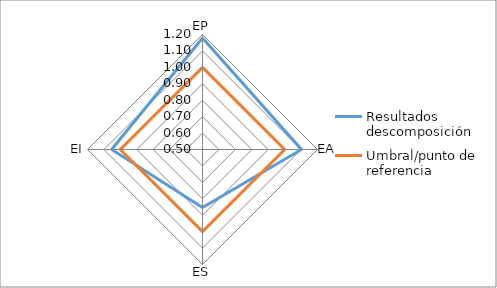
| Category | Resultados descomposición | Umbral/punto de referencia |
|---|---|---|
| EP | 1.179 | 1 |
| EA | 1.102 | 1 |
| ES | 0.853 | 1 |
| EI | 1.053 | 1 |